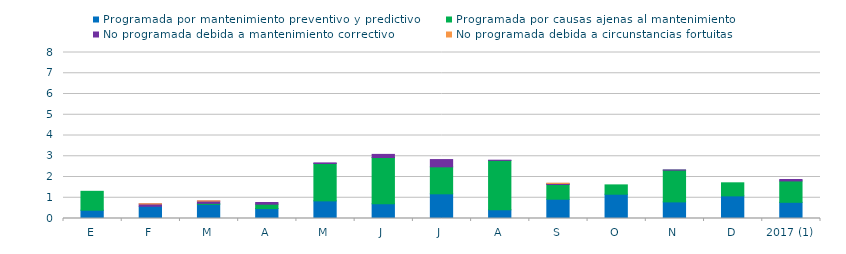
| Category | Programada por mantenimiento preventivo y predictivo | Programada por causas ajenas al mantenimiento  | No programada debida a mantenimiento correctivo  | No programada debida a circunstancias fortuitas  |
|---|---|---|---|---|
| E | 0.4 | 0.91 | 0 | 0 |
| F | 0.59 | 0 | 0.11 | 0.01 |
| M | 0.68 | 0.05 | 0.11 | 0.01 |
| A | 0.48 | 0.21 | 0.08 | 0 |
| M | 0.85 | 1.8 | 0.03 | 0 |
| J | 0.71 | 2.23 | 0.15 | 0 |
| J | 1.19 | 1.3 | 0.35 | 0 |
| A | 0.42 | 2.38 | 0.01 | 0 |
| S | 0.93 | 0.71 | 0.05 | 0.01 |
| O | 1.17 | 0.45 | 0 | 0 |
| N | 0.8 | 1.53 | 0.01 | 0 |
| D | 1.09 | 0.63 | 0 | 0 |
| 2017 (1) | 0.78 | 1.03 | 0.07 | 0 |